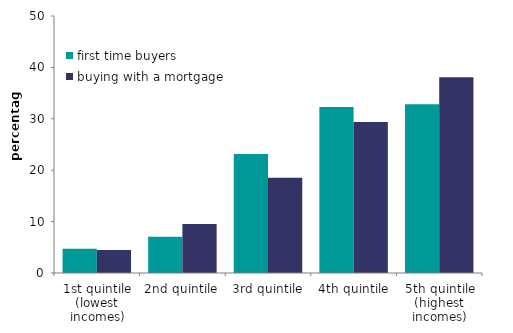
| Category | first time buyers | buying with a mortgage |
|---|---|---|
| 1st quintile (lowest incomes) | 4.709 | 4.482 |
| 2nd quintile | 7.037 | 9.513 |
| 3rd quintile | 23.157 | 18.547 |
| 4th quintile | 32.283 | 29.398 |
| 5th quintile (highest incomes) | 32.814 | 38.06 |